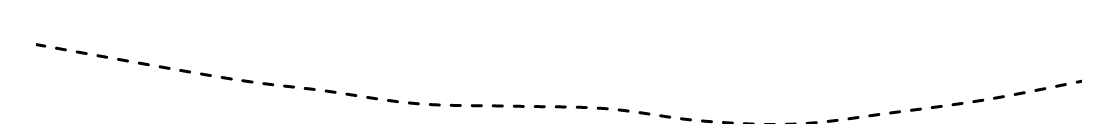
| Category | Series 0 |
|---|---|
| 500.0 | 380 |
| 1500.0 | 446 |
| 2000.0 | 470 |
| 2500.0 | 496 |
| 3000.0 | 501 |
| 3500.0 | 506 |
| 4000.0 | 530 |
| 4500.0 | 536 |
| 5000.0 | 514 |
| 5500.0 | 488 |
| 6000.0 | 452 |